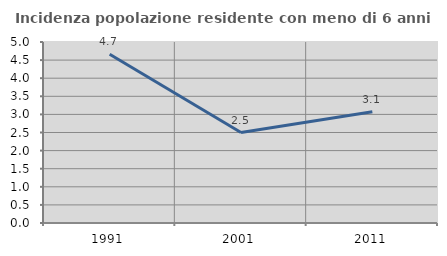
| Category | Incidenza popolazione residente con meno di 6 anni |
|---|---|
| 1991.0 | 4.663 |
| 2001.0 | 2.5 |
| 2011.0 | 3.074 |